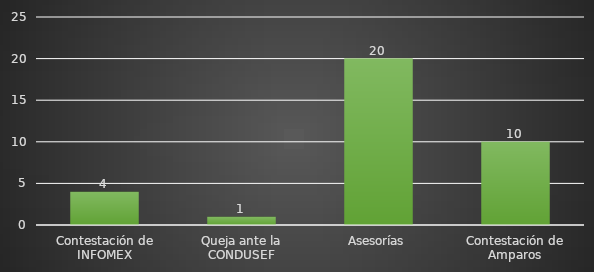
| Category | INDICADOR  |
|---|---|
| Contestación de INFOMEX | 4 |
| Queja ante la CONDUSEF | 1 |
| Asesorías | 20 |
| Contestación de Amparos | 10 |